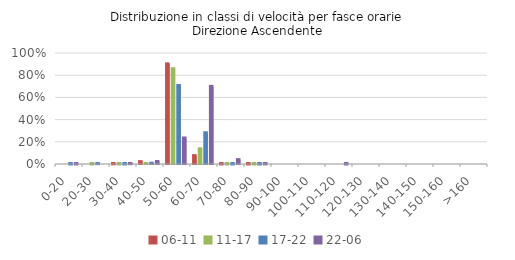
| Category | 06-11 | 11-17 | 17-22 | 22-06 |
|---|---|---|---|---|
| 0-20 | 0 | 0 | 0 | 0 |
| 20-30 | 0 | 0 | 0.003 | 0 |
| 30-40 | 0.001 | 0 | 0.001 | 0.003 |
| 40-50 | 0.021 | 0.004 | 0.007 | 0.022 |
| 50-60 | 0.902 | 0.859 | 0.707 | 0.235 |
| 60-70 | 0.075 | 0.137 | 0.281 | 0.699 |
| 70-80 | 0 | 0 | 0 | 0.039 |
| 80-90 | 0 | 0 | 0 | 0.001 |
| 90-100 | 0 | 0 | 0 | 0 |
| 100-110 | 0 | 0 | 0 | 0 |
| 110-120 | 0 | 0 | 0 | 0 |
| 120-130 | 0 | 0 | 0 | 0 |
| 130-140 | 0 | 0 | 0 | 0 |
| 140-150 | 0 | 0 | 0 | 0 |
| 150-160 | 0 | 0 | 0 | 0 |
| >160 | 0 | 0 | 0 | 0 |